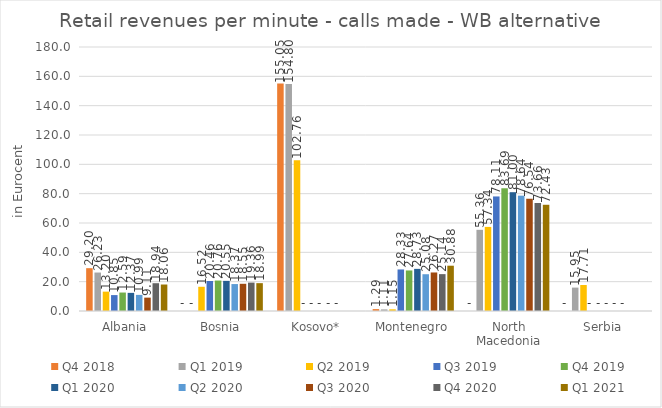
| Category | Q4 2018 | Q1 2019 | Q2 2019 | Q3 2019 | Q4 2019 | Q1 2020 | Q2 2020 | Q3 2020 | Q4 2020 | Q1 2021 |
|---|---|---|---|---|---|---|---|---|---|---|
| Albania | 29.197 | 26.228 | 13.2 | 10.848 | 12.586 | 12.366 | 10.985 | 9.115 | 18.94 | 18.058 |
| Bosnia | 0 | 0 | 16.518 | 20.456 | 20.763 | 20.546 | 18.369 | 18.552 | 19.363 | 18.986 |
| Kosovo* | 155.045 | 154.796 | 102.757 | 0 | 0 | 0 | 0 | 0 | 0 | 0 |
| Montenegro | 1.294 | 1.107 | 1.147 | 28.325 | 27.644 | 28.728 | 25.075 | 26.267 | 25.143 | 30.882 |
| North Macedonia | 0 | 55.355 | 57.338 | 78.106 | 83.688 | 81 | 78.638 | 76.536 | 73.656 | 72.427 |
| Serbia | 0 | 15.953 | 17.712 | 0 | 0 | 0 | 0 | 0 | 0 | 0 |